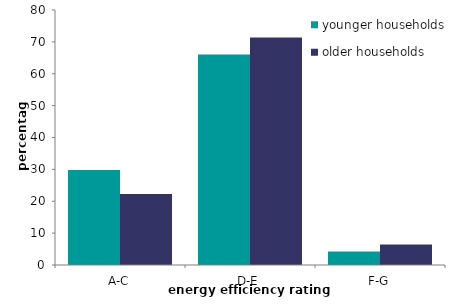
| Category | younger households | older households |
|---|---|---|
| A-C | 29.778 | 22.248 |
| D-E | 66.005 | 71.356 |
| F-G | 4.216 | 6.396 |